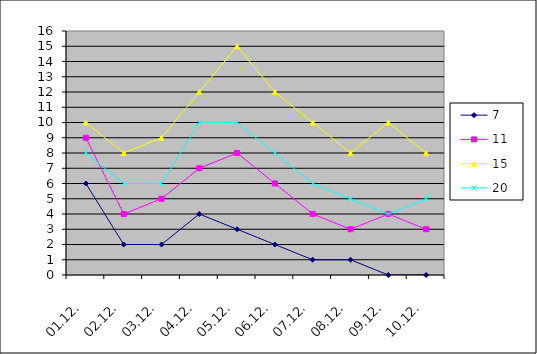
| Category | 7 | 11 | 15 | 20 |
|---|---|---|---|---|
| 01.12. | 6 | 9 | 10 | 8 |
| 02.12. | 2 | 4 | 8 | 6 |
| 03.12. | 2 | 5 | 9 | 6 |
| 04.12. | 4 | 7 | 12 | 10 |
| 05.12. | 3 | 8 | 15 | 10 |
| 06.12. | 2 | 6 | 12 | 8 |
| 07.12. | 1 | 4 | 10 | 6 |
| 08.12. | 1 | 3 | 8 | 5 |
| 09.12. | 0 | 4 | 10 | 4 |
| 10.12. | 0 | 3 | 8 | 5 |